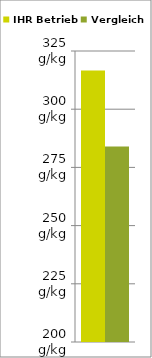
| Category | IHR Betrieb | Vergleich |
|---|---|---|
| 0 | 316.572 | 284 |